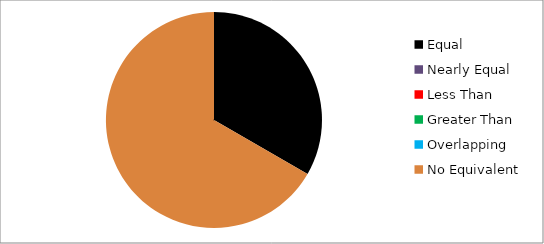
| Category | Series 0 |
|---|---|
| Equal | 2 |
| Nearly Equal | 0 |
| Less Than | 0 |
| Greater Than | 0 |
| Overlapping | 0 |
| No Equivalent | 4 |